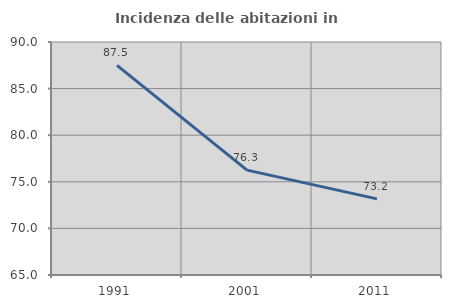
| Category | Incidenza delle abitazioni in proprietà  |
|---|---|
| 1991.0 | 87.5 |
| 2001.0 | 76.25 |
| 2011.0 | 73.171 |